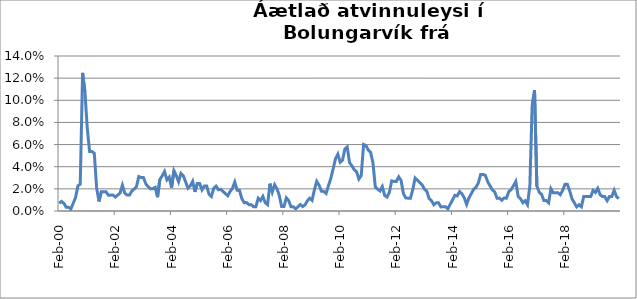
| Category | Series 0 |
|---|---|
| 2000-02-01 | 0.007 |
| 2000-03-01 | 0.009 |
| 2000-04-01 | 0.007 |
| 2000-05-01 | 0.003 |
| 2000-06-01 | 0.003 |
| 2000-07-01 | 0.002 |
| 2000-08-01 | 0.007 |
| 2000-09-01 | 0.012 |
| 2000-10-01 | 0.023 |
| 2000-11-01 | 0.024 |
| 2000-12-01 | 0.125 |
| 2001-01-01 | 0.108 |
| 2001-02-01 | 0.075 |
| 2001-03-01 | 0.054 |
| 2001-04-01 | 0.054 |
| 2001-05-01 | 0.052 |
| 2001-06-01 | 0.021 |
| 2001-07-01 | 0.009 |
| 2001-08-01 | 0.017 |
| 2001-09-01 | 0.017 |
| 2001-10-01 | 0.017 |
| 2001-11-01 | 0.014 |
| 2001-12-01 | 0.014 |
| 2002-01-01 | 0.014 |
| 2002-02-01 | 0.013 |
| 2002-03-01 | 0.014 |
| 2002-04-01 | 0.016 |
| 2002-05-01 | 0.023 |
| 2002-06-01 | 0.016 |
| 2002-07-01 | 0.014 |
| 2002-08-01 | 0.014 |
| 2002-09-01 | 0.018 |
| 2002-10-01 | 0.02 |
| 2002-11-01 | 0.022 |
| 2002-12-01 | 0.031 |
| 2003-01-01 | 0.03 |
| 2003-02-01 | 0.03 |
| 2003-03-01 | 0.025 |
| 2003-04-01 | 0.022 |
| 2003-05-01 | 0.02 |
| 2003-06-01 | 0.02 |
| 2003-07-01 | 0.021 |
| 2003-08-01 | 0.012 |
| 2003-09-01 | 0.028 |
| 2003-10-01 | 0.032 |
| 2003-11-01 | 0.036 |
| 2003-12-01 | 0.028 |
| 2004-01-01 | 0.031 |
| 2004-02-01 | 0.021 |
| 2004-03-01 | 0.036 |
| 2004-04-01 | 0.032 |
| 2004-05-01 | 0.026 |
| 2004-06-01 | 0.034 |
| 2004-07-01 | 0.032 |
| 2004-08-01 | 0.026 |
| 2004-09-01 | 0.021 |
| 2004-10-01 | 0.023 |
| 2004-11-01 | 0.027 |
| 2004-12-01 | 0.017 |
| 2005-01-01 | 0.025 |
| 2005-02-01 | 0.025 |
| 2005-03-01 | 0.019 |
| 2005-04-01 | 0.023 |
| 2005-05-01 | 0.023 |
| 2005-06-01 | 0.015 |
| 2005-07-01 | 0.013 |
| 2005-08-01 | 0.021 |
| 2005-09-01 | 0.022 |
| 2005-10-01 | 0.019 |
| 2005-11-01 | 0.02 |
| 2005-12-01 | 0.018 |
| 2006-01-01 | 0.016 |
| 2006-02-01 | 0.014 |
| 2006-03-01 | 0.018 |
| 2006-04-01 | 0.021 |
| 2006-05-01 | 0.026 |
| 2006-06-01 | 0.019 |
| 2006-07-01 | 0.019 |
| 2006-08-01 | 0.011 |
| 2006-09-01 | 0.007 |
| 2006-10-01 | 0.008 |
| 2006-11-01 | 0.006 |
| 2006-12-01 | 0.006 |
| 2007-01-01 | 0.004 |
| 2007-02-01 | 0.004 |
| 2007-03-01 | 0.012 |
| 2007-04-01 | 0.009 |
| 2007-05-01 | 0.013 |
| 2007-06-01 | 0.008 |
| 2007-07-01 | 0.006 |
| 2007-08-01 | 0.025 |
| 2007-09-01 | 0.017 |
| 2007-10-01 | 0.024 |
| 2007-11-01 | 0.02 |
| 2007-12-01 | 0.014 |
| 2008-01-01 | 0.004 |
| 2008-02-01 | 0.004 |
| 2008-03-01 | 0.012 |
| 2008-04-01 | 0.009 |
| 2008-05-01 | 0.004 |
| 2008-06-01 | 0.004 |
| 2008-07-01 | 0.002 |
| 2008-08-01 | 0.004 |
| 2008-09-01 | 0.006 |
| 2008-10-01 | 0.004 |
| 2008-11-01 | 0.006 |
| 2008-12-01 | 0.009 |
| 2009-01-01 | 0.012 |
| 2009-02-01 | 0.01 |
| 2009-03-01 | 0.019 |
| 2009-04-01 | 0.027 |
| 2009-05-01 | 0.023 |
| 2009-06-01 | 0.018 |
| 2009-07-01 | 0.018 |
| 2009-08-01 | 0.016 |
| 2009-09-01 | 0.023 |
| 2009-10-01 | 0.029 |
| 2009-11-01 | 0.038 |
| 2009-12-01 | 0.047 |
| 2010-01-01 | 0.051 |
| 2010-02-01 | 0.044 |
| 2010-03-01 | 0.046 |
| 2010-04-01 | 0.056 |
| 2010-05-01 | 0.058 |
| 2010-06-01 | 0.044 |
| 2010-07-01 | 0.041 |
| 2010-08-01 | 0.037 |
| 2010-09-01 | 0.035 |
| 2010-10-01 | 0.029 |
| 2010-11-01 | 0.032 |
| 2010-12-01 | 0.06 |
| 2011-01-01 | 0.059 |
| 2011-02-01 | 0.055 |
| 2011-03-01 | 0.053 |
| 2011-04-01 | 0.043 |
| 2011-05-01 | 0.022 |
| 2011-06-01 | 0.02 |
| 2011-07-01 | 0.018 |
| 2011-08-01 | 0.022 |
| 2011-09-01 | 0.014 |
| 2011-10-01 | 0.013 |
| 2011-11-01 | 0.017 |
| 2011-12-01 | 0.027 |
| 2012-01-01 | 0.027 |
| 2012-02-01 | 0.027 |
| 2012-03-01 | 0.031 |
| 2012-04-01 | 0.028 |
| 2012-05-01 | 0.016 |
| 2012-06-01 | 0.012 |
| 2012-07-01 | 0.012 |
| 2012-08-01 | 0.012 |
| 2012-09-01 | 0.019 |
| 2012-10-01 | 0.03 |
| 2012-11-01 | 0.028 |
| 2012-12-01 | 0.026 |
| 2013-01-01 | 0.024 |
| 2013-02-01 | 0.02 |
| 2013-03-01 | 0.018 |
| 2013-04-01 | 0.011 |
| 2013-05-01 | 0.009 |
| 2013-06-01 | 0.006 |
| 2013-07-01 | 0.007 |
| 2013-08-01 | 0.007 |
| 2013-09-01 | 0.004 |
| 2013-10-01 | 0.004 |
| 2013-11-01 | 0.004 |
| 2013-12-01 | 0.002 |
| 2014-01-01 | 0.006 |
| 2014-02-01 | 0.01 |
| 2014-03-01 | 0.014 |
| 2014-04-01 | 0.014 |
| 2014-05-01 | 0.018 |
| 2014-06-01 | 0.016 |
| 2014-07-01 | 0.012 |
| 2014-08-01 | 0.006 |
| 2014-09-01 | 0.012 |
| 2014-10-01 | 0.016 |
| 2014-11-01 | 0.02 |
| 2014-12-01 | 0.021 |
| 2015-01-01 | 0.025 |
| 2015-02-01 | 0.033 |
| 2015-03-01 | 0.033 |
| 2015-04-01 | 0.032 |
| 2015-05-01 | 0.026 |
| 2015-06-01 | 0.023 |
| 2015-07-01 | 0.019 |
| 2015-08-01 | 0.017 |
| 2015-09-01 | 0.011 |
| 2015-10-01 | 0.012 |
| 2015-11-01 | 0.01 |
| 2015-12-01 | 0.012 |
| 2016-01-01 | 0.012 |
| 2016-02-01 | 0.017 |
| 2016-03-01 | 0.019 |
| 2016-04-01 | 0.023 |
| 2016-05-01 | 0.027 |
| 2016-06-01 | 0.013 |
| 2016-07-01 | 0.011 |
| 2016-08-01 | 0.007 |
| 2016-09-01 | 0.009 |
| 2016-10-01 | 0.006 |
| 2016-11-01 | 0.023 |
| 2016-12-01 | 0.096 |
| 2017-01-01 | 0.109 |
| 2017-02-01 | 0.023 |
| 2017-03-01 | 0.017 |
| 2017-04-01 | 0.015 |
| 2017-05-01 | 0.009 |
| 2017-06-01 | 0.009 |
| 2017-07-01 | 0.007 |
| 2017-08-01 | 0.02 |
| 2017-09-01 | 0.016 |
| 2017-10-01 | 0.017 |
| 2017-11-01 | 0.017 |
| 2017-12-01 | 0.015 |
| 2018-01-01 | 0.019 |
| 2018-02-01 | 0.024 |
| 2018-03-01 | 0.024 |
| 2018-04-01 | 0.018 |
| 2018-05-01 | 0.011 |
| 2018-06-01 | 0.007 |
| 2018-07-01 | 0.004 |
| 2018-08-01 | 0.006 |
| 2018-09-01 | 0.004 |
| 2018-10-01 | 0.013 |
| 2018-11-01 | 0.013 |
| 2018-12-01 | 0.013 |
| 2019-01-01 | 0.013 |
| 2019-02-01 | 0.019 |
| 2019-03-01 | 0.017 |
| 2019-04-01 | 0.02 |
| 2019-05-01 | 0.015 |
| 2019-06-01 | 0.013 |
| 2019-07-01 | 0.013 |
| 2019-08-01 | 0.009 |
| 2019-09-01 | 0.013 |
| 2019-10-01 | 0.013 |
| 2019-11-01 | 0.019 |
| 2019-12-01 | 0.013 |
| 2020-01-01 | 0.011 |